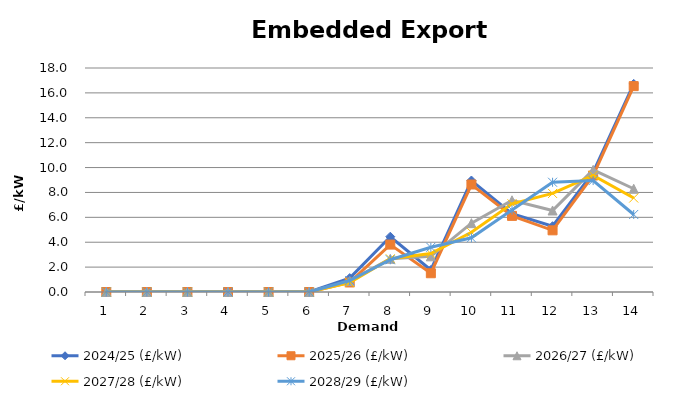
| Category | 2024/25 (£/kW) | 2025/26 (£/kW) | 2026/27 (£/kW) | 2027/28 (£/kW) | 2028/29 (£/kW) |
|---|---|---|---|---|---|
| 1.0 | 0 | 0 | 0 | 0 | 0 |
| 2.0 | 0 | 0 | 0 | 0 | 0 |
| 3.0 | 0 | 0 | 0 | 0 | 0 |
| 4.0 | 0 | 0 | 0 | 0 | 0 |
| 5.0 | 0 | 0 | 0 | 0 | 0 |
| 6.0 | 0 | 0 | 0 | 0 | 0 |
| 7.0 | 1.117 | 0.766 | 0.873 | 0.752 | 0.922 |
| 8.0 | 4.442 | 3.81 | 2.667 | 2.669 | 2.591 |
| 9.0 | 1.769 | 1.507 | 2.865 | 3.092 | 3.592 |
| 10.0 | 8.958 | 8.638 | 5.532 | 4.795 | 4.356 |
| 11.0 | 6.303 | 6.117 | 7.368 | 7.086 | 6.584 |
| 12.0 | 5.289 | 4.955 | 6.55 | 7.92 | 8.819 |
| 13.0 | 9.606 | 9.361 | 9.814 | 9.373 | 8.955 |
| 14.0 | 16.722 | 16.543 | 8.296 | 7.551 | 6.23 |